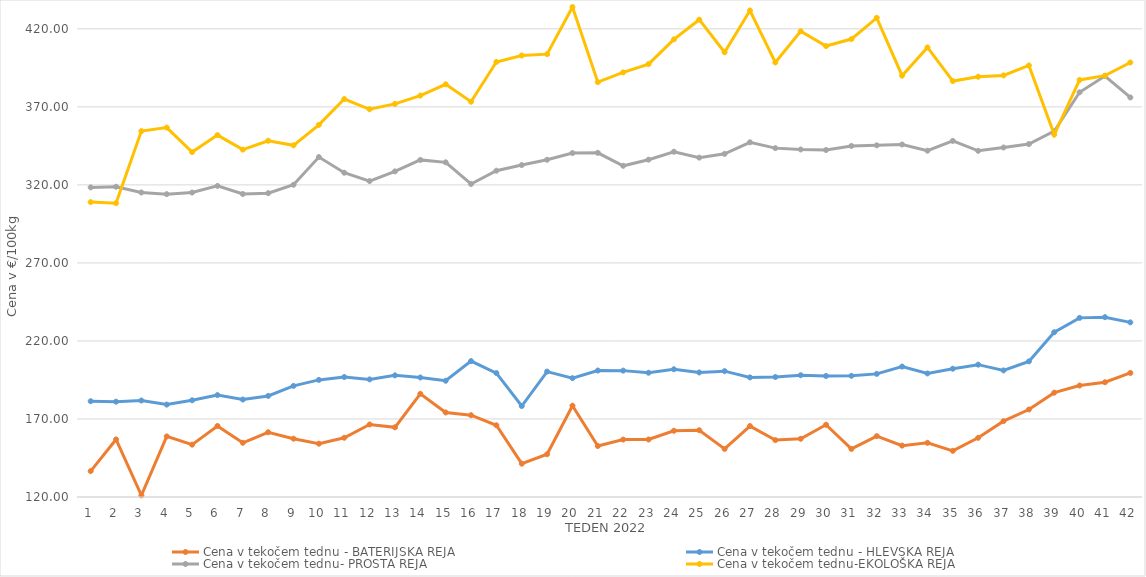
| Category | Cena v tekočem tednu - BATERIJSKA REJA | Cena v tekočem tednu - HLEVSKA REJA | Cena v tekočem tednu- PROSTA REJA | Cena v tekočem tednu-EKOLOŠKA REJA |
|---|---|---|---|---|
| 1.0 | 136.59 | 181.38 | 318.4 | 308.97 |
| 2.0 | 156.88 | 181.07 | 318.82 | 308.28 |
| 3.0 | 121.07 | 181.83 | 315.14 | 354.48 |
| 4.0 | 158.82 | 179.22 | 314.08 | 356.72 |
| 5.0 | 153.55 | 181.96 | 315.1 | 341.03 |
| 6.0 | 165.51 | 185.31 | 319.38 | 351.9 |
| 7.0 | 154.74 | 182.45 | 314.16 | 342.59 |
| 8.0 | 161.48 | 184.77 | 314.71 | 348.28 |
| 9.0 | 157.38 | 191.21 | 320.1 | 345.35 |
| 10.0 | 154.16 | 195.04 | 337.83 | 358.45 |
| 11.0 | 157.96 | 196.88 | 327.79 | 375 |
| 12.0 | 166.49 | 195.36 | 322.46 | 368.45 |
| 13.0 | 164.66 | 197.95 | 328.67 | 371.9 |
| 14.0 | 186.11 | 196.59 | 336.02 | 377.24 |
| 15.0 | 174.18 | 194.49 | 334.46 | 384.48 |
| 16.0 | 172.42 | 207.1 | 320.58 | 373.28 |
| 17.0 | 165.96 | 199.41 | 329.11 | 398.79 |
| 18.0 | 141.36 | 178.29 | 332.71 | 402.93 |
| 19.0 | 147.43 | 200.37 | 336.11 | 403.79 |
| 20.0 | 178.51 | 196.16 | 340.4 | 433.97 |
| 21.0 | 152.67 | 201.05 | 340.55 | 385.86 |
| 22.0 | 156.8 | 200.98 | 332.23 | 392.07 |
| 23.0 | 156.84 | 199.63 | 336.16 | 397.41 |
| 24.0 | 162.44 | 201.86 | 341.24 | 413.28 |
| 25.0 | 162.78 | 199.81 | 337.48 | 425.86 |
| 26.0 | 150.82 | 200.65 | 339.9 | 405 |
| 27.0 | 165.45 | 196.64 | 347.3 | 431.72 |
| 28.0 | 156.46 | 196.88 | 343.56 | 398.45 |
| 29.0 | 157.31 | 198.03 | 342.71 | 418.45 |
| 30.0 | 166.29 | 197.55 | 342.35 | 408.97 |
| 31.0 | 150.81 | 197.66 | 344.97 | 413.45 |
| 32.0 | 158.99 | 198.9 | 345.35 | 427.07 |
| 33.0 | 152.91 | 203.57 | 345.9 | 390 |
| 34.0 | 154.73 | 199.17 | 341.92 | 408.1 |
| 35.0 | 149.6 | 202.21 | 348.2 | 386.55 |
| 36.0 | 157.93 | 204.81 | 341.85 | 389.31 |
| 37.0 | 168.61 | 201.11 | 343.97 | 390.17 |
| 38.0 | 176.07 | 206.91 | 346.16 | 396.55 |
| 39.0 | 186.86 | 225.6 | 354.41 | 352.24 |
| 40.0 | 191.45 | 234.79 | 379.35 | 387.24 |
| 41.0 | 193.52 | 235.24 | 389.75 | 390 |
| 42.0 | 199.51 | 231.92 | 376.02 | 398.45 |